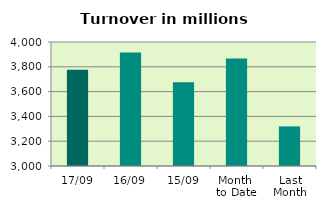
| Category | Series 0 |
|---|---|
| 17/09 | 3776.289 |
| 16/09 | 3915.977 |
| 15/09 | 3674.815 |
| Month 
to Date | 3866.295 |
| Last
Month | 3319.434 |